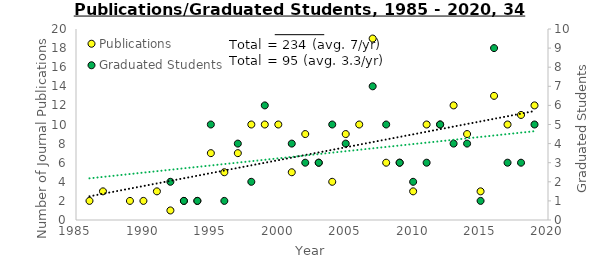
| Category | Publications |
|---|---|
| 1986.0 | 2 |
| 1987.0 | 3 |
| 1989.0 | 2 |
| 1990.0 | 2 |
| 1991.0 | 3 |
| 1992.0 | 1 |
| 1993.0 | 2 |
| 1994.0 | 2 |
| 1995.0 | 7 |
| 1996.0 | 5 |
| 1997.0 | 7 |
| 1998.0 | 10 |
| 1999.0 | 10 |
| 2000.0 | 10 |
| 2001.0 | 5 |
| 2002.0 | 9 |
| 2003.0 | 6 |
| 2004.0 | 4 |
| 2005.0 | 9 |
| 2006.0 | 10 |
| 2007.0 | 19 |
| 2008.0 | 6 |
| 2009.0 | 6 |
| 2010.0 | 3 |
| 2011.0 | 10 |
| 2012.0 | 10 |
| 2013.0 | 12 |
| 2014.0 | 9 |
| 2015.0 | 3 |
| 2016.0 | 13 |
| 2017.0 | 10 |
| 2018.0 | 11 |
| 2019.0 | 12 |